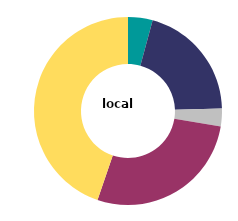
| Category | local 
authority |
|---|---|
| garage or car port - on plot | 4.228 |
| designated parking space - on plot | 20.33 |
| off plot designated parking | 3.062 |
| communal parking  | 27.638 |
| no designated parking provision | 44.741 |